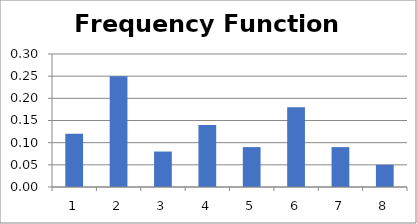
| Category | f(x) |
|---|---|
| 0 | 0.12 |
| 1 | 0.25 |
| 2 | 0.08 |
| 3 | 0.14 |
| 4 | 0.09 |
| 5 | 0.18 |
| 6 | 0.09 |
| 7 | 0.05 |